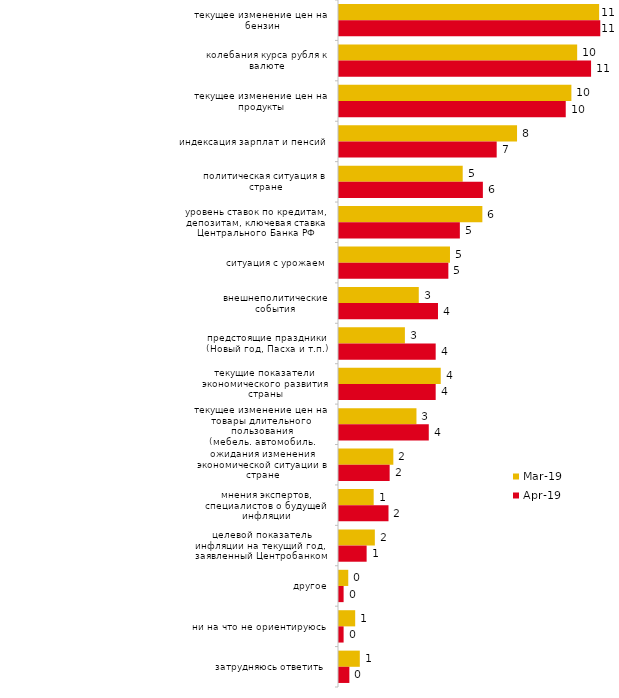
| Category | мар.19 | апр.19 |
|---|---|---|
| текущее изменение цен на бензин | 11.188 | 11.238 |
| колебания курса рубля к валюте | 10.244 | 10.842 |
| текущее изменение цен на продукты | 9.995 | 9.752 |
| индексация зарплат и пенсий | 7.658 | 6.782 |
| политическая ситуация в стране | 5.321 | 6.188 |
| уровень ставок по кредитам, депозитам, ключевая ставка Центрального Банка РФ | 6.166 | 5.198 |
| ситуация с урожаем | 4.774 | 4.703 |
| внешнеполитические события | 3.431 | 4.257 |
| предстоящие праздники (Новый год, Пасха и т.п.) | 2.834 | 4.158 |
| текущие показатели экономического развития страны | 4.376 | 4.158 |
| текущее изменение цен на товары длительного пользования (мебель, автомобиль, бытовая техника и т.п.) | 3.332 | 3.861 |
| ожидания изменения экономической ситуации в стране | 2.337 | 2.178 |
| мнения экспертов, специалистов о будущей инфляции | 1.492 | 2.129 |
| целевой показатель инфляции на текущий год, заявленный Центробанком | 1.542 | 1.188 |
| другое | 0.398 | 0.198 |
| ни на что не ориентируюсь | 0.696 | 0.198 |
| затрудняюсь ответить | 0.895 | 0.446 |